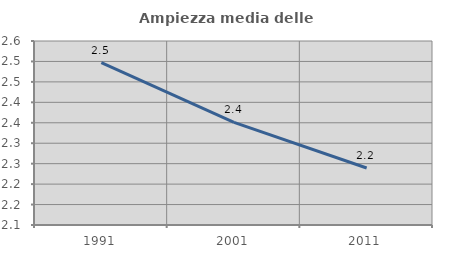
| Category | Ampiezza media delle famiglie |
|---|---|
| 1991.0 | 2.497 |
| 2001.0 | 2.351 |
| 2011.0 | 2.239 |